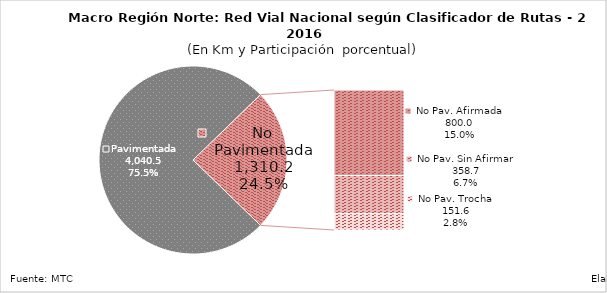
| Category | Series 0 |
|---|---|
| Pavimentada | 4040.461 |
| No Pavimentada                   Afirmada | 799.95 |
| No Pavimentada                   Sin Afirmar | 358.656 |
| No Pavimentada                            Trocha | 151.569 |